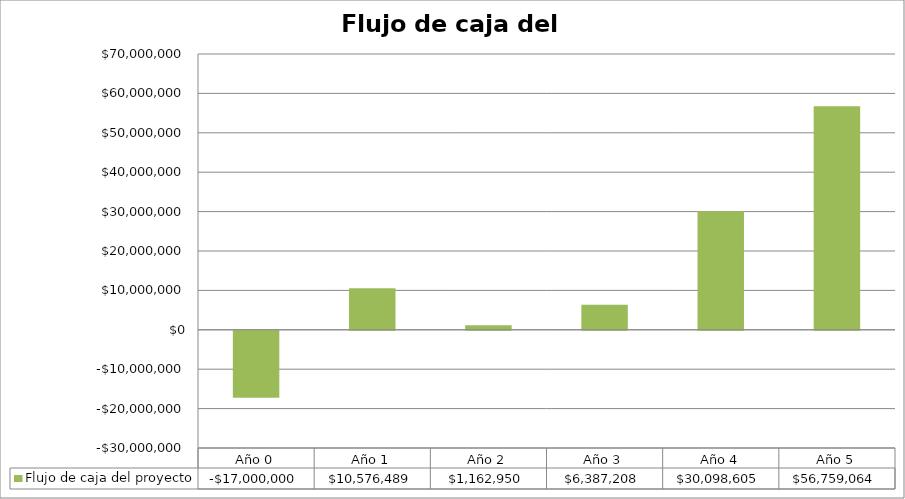
| Category | Flujo de caja del proyecto |
|---|---|
| Año 0 | -17000000 |
| Año 1 | 10576488.645 |
| Año 2 | 1162950.329 |
| Año 3 | 6387208.181 |
| Año 4 | 30098605.416 |
| Año 5 | 56759063.934 |